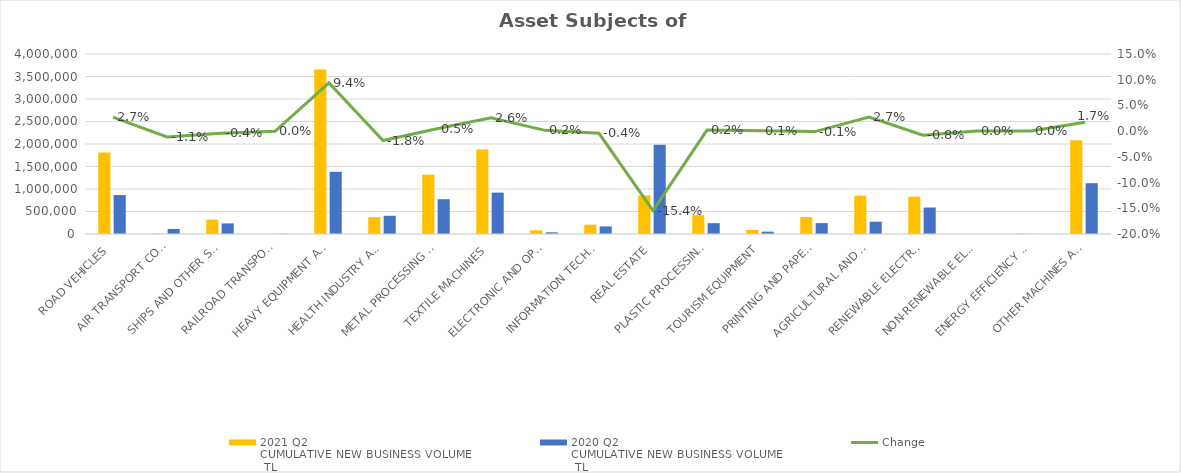
| Category | 2021 Q2 
CUMULATIVE NEW BUSINESS VOLUME
 TL | 2020 Q2 
CUMULATIVE NEW BUSINESS VOLUME
 TL |
|---|---|---|
| ROAD VEHICLES | 1811135.997 | 865351.897 |
| AIR TRANSPORT CONVEYANCE | 11001 | 112086.655 |
| SHIPS AND OTHER SEA-GOING VESSELS | 320305.586 | 235337.506 |
| RAILROAD TRANSPORT VEHICLES | 0 | 3781 |
| HEAVY EQUIPMENT AND CONSTRUCTION MACHINERY | 3653356.123 | 1382400.169 |
| HEALTH INDUSTRY AND AESTHETIC INSTRUMENTS | 373993.543 | 404246.178 |
| METAL PROCESSING MACHINE | 1318756.467 | 773258.623 |
| TEXTILE MACHINES | 1878793.638 | 920076.923 |
| ELECTRONIC AND OPTICAL DEVICES | 83696.658 | 37320.826 |
| INFORMATION TECHNOLOGIES AND OFFICE SYSTEMS | 207586.785 | 168806.793 |
| REAL ESTATE | 856050.224 | 1984124.5 |
| PLASTIC PROCESSING MACHINES | 419024.727 | 240824.586 |
| TOURISM EQUIPMENT | 92221.875 | 52169.921 |
| PRINTING AND PAPER PROCESSING MACHINES | 375645.664 | 241573.446 |
| AGRICULTURAL AND LIVESTOCK FARMING MACHINES | 852567.645 | 272901.636 |
| RENEWABLE ELECTRICITY GENERATION | 829377.181 | 588757.902 |
| NON-RENEWABLE ELECTRIC ENERGY GENERATION | 2857 | 0 |
| ENERGY EFFICIENCY EQUIPMENT | 8548.692 | 1202.74 |
| OTHER MACHINES AND EQUIPMENT | 2082720.629 | 1129823.015 |